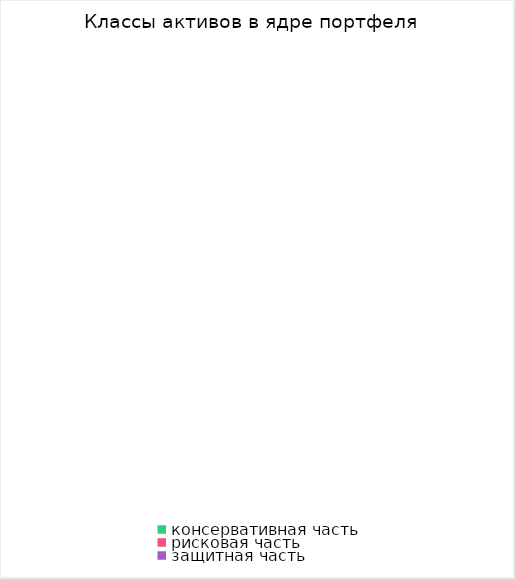
| Category | Series 0 |
|---|---|
| консервативная часть | 0 |
| рисковая часть | 0 |
| защитная часть | 0 |